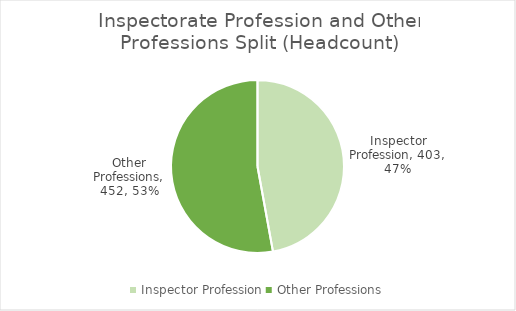
| Category | Headcount |
|---|---|
| Inspector Profession | 403 |
| Other Professions | 452 |